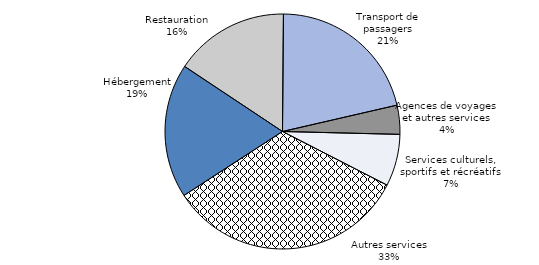
| Category | Series 0 |
|---|---|
| Hébergement | 0.185 |
| Restauration | 0.158 |
| Transport de passagers | 0.213 |
| Agences de voyages et autres services | 0.04 |
| Services culturels, sportifs et récréatifs | 0.072 |
| Autres services | 0.333 |